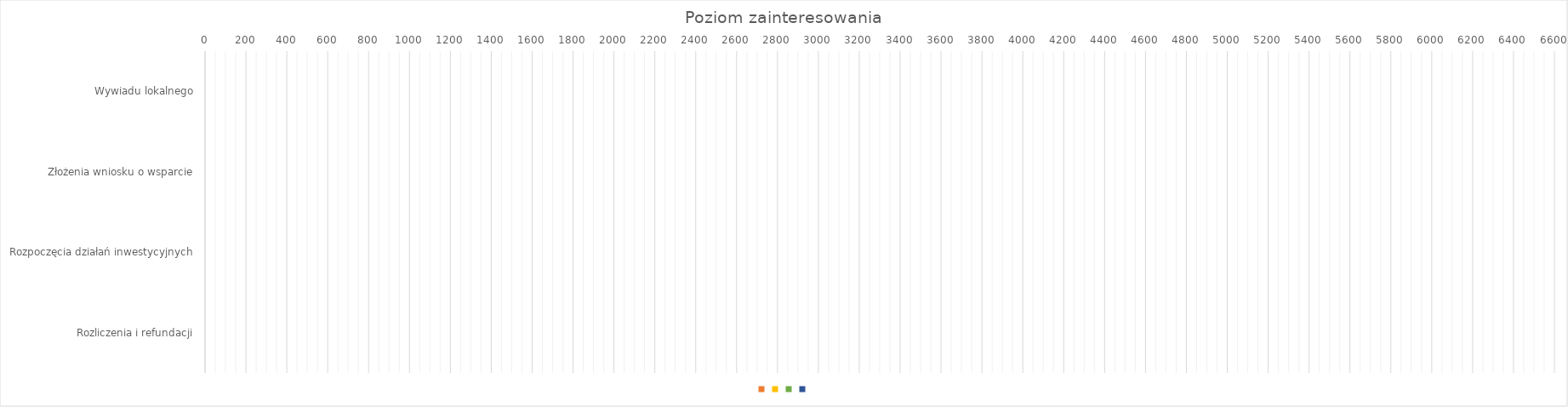
| Category | Series 0 | Series 1 | Series 2 | Series 3 |
|---|---|---|---|---|
| Wywiadu lokalnego | 0 | 0 | 0 | 0 |
| Złożenia wniosku o wsparcie | 0 | 0 | 0 | 0 |
| Rozpoczęcia działań inwestycyjnych | 0 | 0 | 0 | 0 |
| Rozliczenia i refundacji | 0 | 0 | 0 | 0 |